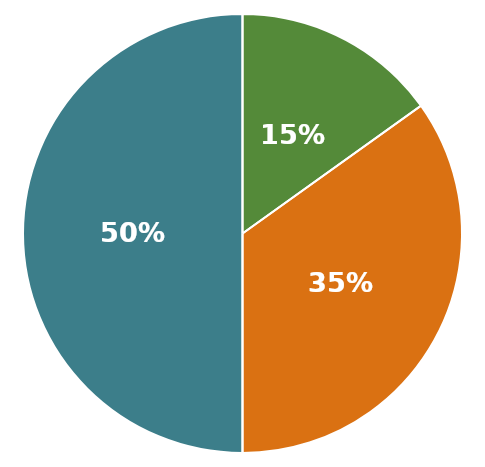
| Category | Общо Активи |
|---|---|
| 0 | 1902500 |
| 1 | 575000 |
| 2 | 1327500 |